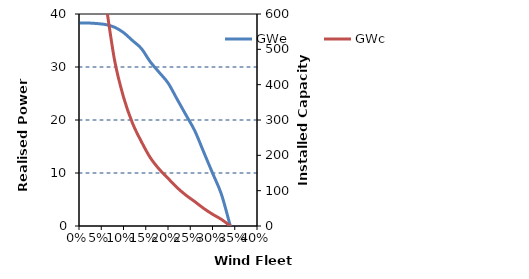
| Category | GWe |
|---|---|
| 0.34 | 0 |
| 0.32 | 6 |
| 0.3 | 10 |
| 0.27999999999999997 | 14 |
| 0.25999999999999995 | 18 |
| 0.23999999999999996 | 21 |
| 0.21999999999999997 | 24 |
| 0.19999999999999998 | 27 |
| 0.18 | 29 |
| 0.16 | 31 |
| 0.14 | 33.5 |
| 0.12000000000000001 | 35 |
| 0.1 | 36.5 |
| 0.08 | 37.5 |
| 0.06 | 38 |
| 0.039999999999999994 | 38.2 |
| 0.019999999999999993 | 38.3 |
| 0.0 | 38.3 |